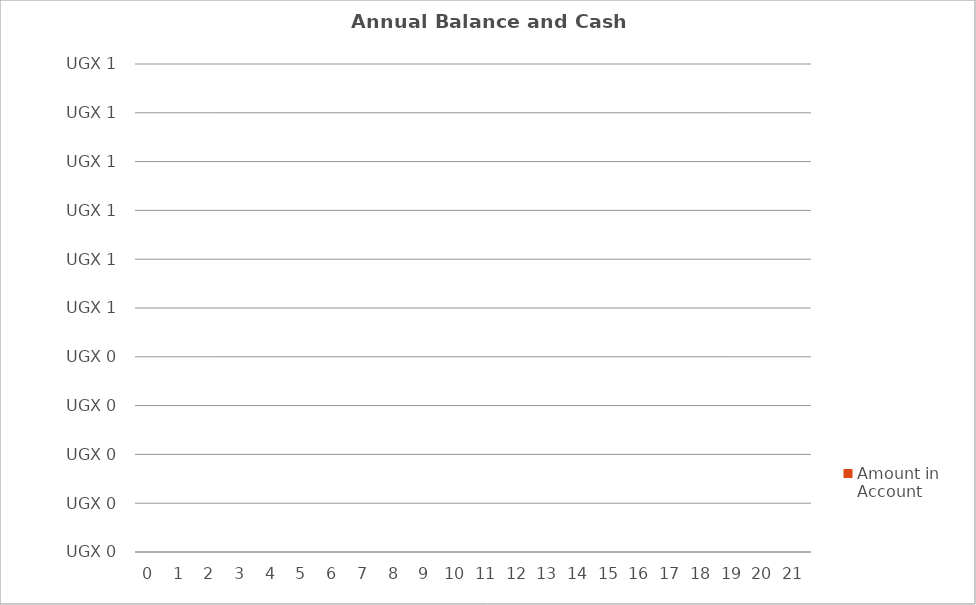
| Category |  Amount in Account  |
|---|---|
| 0.0 | 0 |
| 1.0 | 0 |
| 2.0 | 0 |
| 3.0 | 0 |
| 4.0 | 0 |
| 5.0 | 0 |
| 6.0 | 0 |
| 7.0 | 0 |
| 8.0 | 0 |
| 9.0 | 0 |
| 10.0 | 0 |
| 11.0 | 0 |
| 12.0 | 0 |
| 13.0 | 0 |
| 14.0 | 0 |
| 15.0 | 0 |
| 16.0 | 0 |
| 17.0 | 0 |
| 18.0 | 0 |
| 19.0 | 0 |
| 20.0 | 0 |
| 21.0 | 0 |